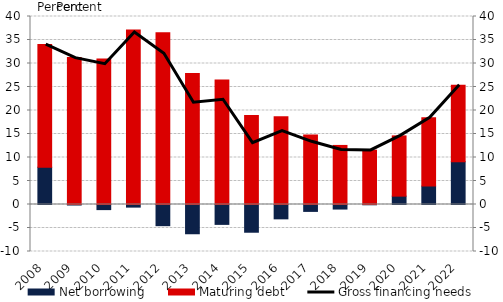
| Category | Net borrowing | Maturing debt |
|---|---|---|
| 2008.0 | 7.937 | 26.102 |
| 2009.0 | -0.115 | 31.264 |
| 2010.0 | -1.088 | 30.946 |
| 2011.0 | -0.558 | 37.14 |
| 2012.0 | -4.505 | 36.569 |
| 2013.0 | -6.224 | 27.885 |
| 2014.0 | -4.231 | 26.516 |
| 2015.0 | -5.901 | 18.943 |
| 2016.0 | -3.053 | 18.692 |
| 2017.0 | -1.469 | 14.806 |
| 2018.0 | -0.969 | 12.568 |
| 2019.0 | -0.061 | 11.558 |
| 2020.0 | 1.776 | 12.821 |
| 2021.0 | 3.911 | 14.533 |
| 2022.0 | 9.107 | 16.243 |